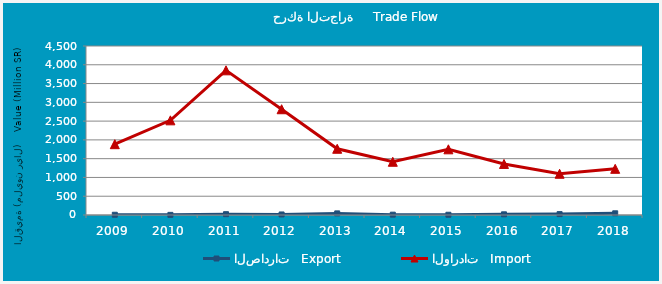
| Category | الصادرات   Export | الواردات   Import |
|---|---|---|
| 2009.0 | 6355259 | 1885266091 |
| 2010.0 | 3645100 | 2520581755 |
| 2011.0 | 22043707 | 3852372644 |
| 2012.0 | 14181835 | 2816138392 |
| 2013.0 | 42737688 | 1763447407 |
| 2014.0 | 8872343 | 1417389251 |
| 2015.0 | 6397397 | 1748896734 |
| 2016.0 | 18242399 | 1359043484 |
| 2017.0 | 23590581 | 1097711442 |
| 2018.0 | 44951682 | 1229590880 |